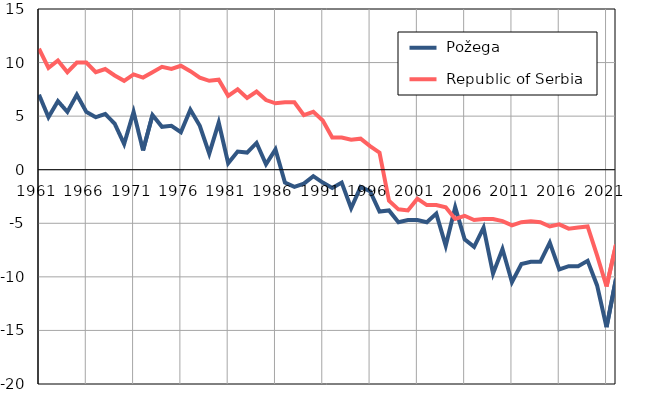
| Category |  Požega |  Republic of Serbia |
|---|---|---|
| 1961.0 | 7 | 11.3 |
| 1962.0 | 4.9 | 9.5 |
| 1963.0 | 6.4 | 10.2 |
| 1964.0 | 5.4 | 9.1 |
| 1965.0 | 7 | 10 |
| 1966.0 | 5.4 | 10 |
| 1967.0 | 4.9 | 9.1 |
| 1968.0 | 5.2 | 9.4 |
| 1969.0 | 4.3 | 8.8 |
| 1970.0 | 2.4 | 8.3 |
| 1971.0 | 5.4 | 8.9 |
| 1972.0 | 1.8 | 8.6 |
| 1973.0 | 5.1 | 9.1 |
| 1974.0 | 4 | 9.6 |
| 1975.0 | 4.1 | 9.4 |
| 1976.0 | 3.5 | 9.7 |
| 1977.0 | 5.6 | 9.2 |
| 1978.0 | 4.1 | 8.6 |
| 1979.0 | 1.5 | 8.3 |
| 1980.0 | 4.4 | 8.4 |
| 1981.0 | 0.6 | 6.9 |
| 1982.0 | 1.7 | 7.5 |
| 1983.0 | 1.6 | 6.7 |
| 1984.0 | 2.5 | 7.3 |
| 1985.0 | 0.5 | 6.5 |
| 1986.0 | 1.9 | 6.2 |
| 1987.0 | -1.2 | 6.3 |
| 1988.0 | -1.6 | 6.3 |
| 1989.0 | -1.3 | 5.1 |
| 1990.0 | -0.6 | 5.4 |
| 1991.0 | -1.2 | 4.6 |
| 1992.0 | -1.7 | 3 |
| 1993.0 | -1.2 | 3 |
| 1994.0 | -3.6 | 2.8 |
| 1995.0 | -1.6 | 2.9 |
| 1996.0 | -2 | 2.2 |
| 1997.0 | -3.9 | 1.6 |
| 1998.0 | -3.8 | -2.9 |
| 1999.0 | -4.9 | -3.7 |
| 2000.0 | -4.7 | -3.8 |
| 2001.0 | -4.7 | -2.7 |
| 2002.0 | -4.9 | -3.3 |
| 2003.0 | -4.1 | -3.3 |
| 2004.0 | -7.1 | -3.5 |
| 2005.0 | -3.5 | -4.6 |
| 2006.0 | -6.5 | -4.3 |
| 2007.0 | -7.2 | -4.7 |
| 2008.0 | -5.4 | -4.6 |
| 2009.0 | -9.7 | -4.6 |
| 2010.0 | -7.4 | -4.8 |
| 2011.0 | -10.5 | -5.2 |
| 2012.0 | -8.8 | -4.9 |
| 2013.0 | -8.6 | -4.8 |
| 2014.0 | -8.6 | -4.9 |
| 2015.0 | -6.8 | -5.3 |
| 2016.0 | -9.3 | -5.1 |
| 2017.0 | -9 | -5.5 |
| 2018.0 | -9 | -5.4 |
| 2019.0 | -8.5 | -5.3 |
| 2020.0 | -10.8 | -8 |
| 2021.0 | -14.7 | -10.9 |
| 2022.0 | -10.2 | -7 |